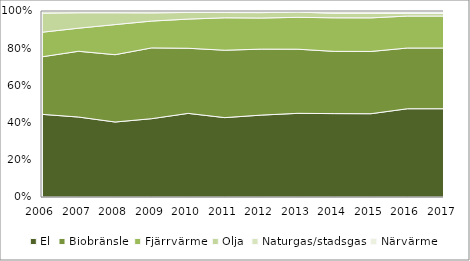
| Category | El | Biobränsle | Fjärrvärme | Olja | Naturgas/stadsgas | Närvärme |
|---|---|---|---|---|---|---|
| 2006 | 0.447 | 0.311 | 0.133 | 0.103 | 0.009 | 0.003 |
| 2007 | 0.43 | 0.354 | 0.124 | 0.083 | 0.006 | 0.003 |
| 2008 | 0.403 | 0.362 | 0.162 | 0.063 | 0.006 | 0.003 |
| 2009 | 0.421 | 0.381 | 0.144 | 0.044 | 0.006 | 0.004 |
| 2010 | 0.45 | 0.35 | 0.157 | 0.036 | 0.006 | 0.002 |
| 2011 | 0.427 | 0.362 | 0.174 | 0.028 | 0.004 | 0.005 |
| 2012 | 0.44 | 0.355 | 0.167 | 0.029 | 0.005 | 0.004 |
| 2013 | 0.45 | 0.345 | 0.172 | 0.028 | 0.003 | 0.003 |
| 2014 | 0.448 | 0.335 | 0.18 | 0.024 | 0.008 | 0.005 |
| 2015 | 0.448 | 0.335 | 0.181 | 0.024 | 0.008 | 0.005 |
| 2016 | 0.475 | 0.326 | 0.172 | 0.013 | 0.008 | 0.006 |
| 2017 | 0.475 | 0.326 | 0.172 | 0.013 | 0.008 | 0.006 |